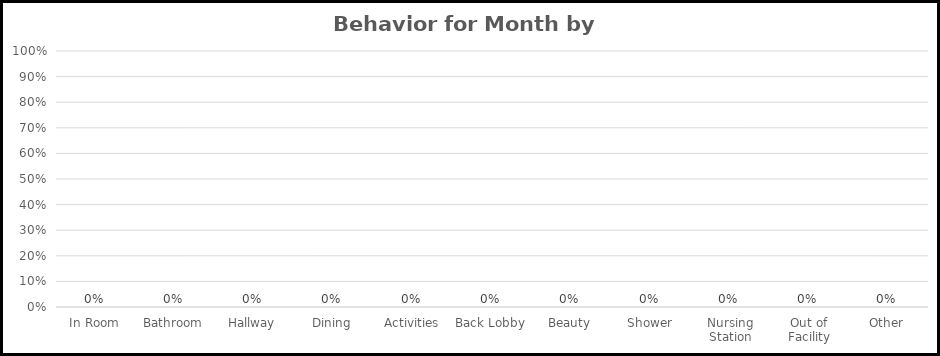
| Category | Behavior for Month by Location |
|---|---|
| In Room | 0 |
| Bathroom | 0 |
| Hallway | 0 |
| Dining | 0 |
| Activities | 0 |
| Back Lobby | 0 |
| Beauty | 0 |
| Shower | 0 |
| Nursing Station | 0 |
| Out of Facility | 0 |
| Other | 0 |